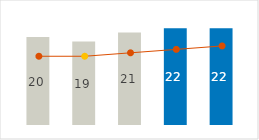
| Category | Freight & Forwarding |
|---|---|
| 0 | 20 |
| 1 | 19 |
| 2 | 21 |
| 3 | 22 |
| 4 | 22 |